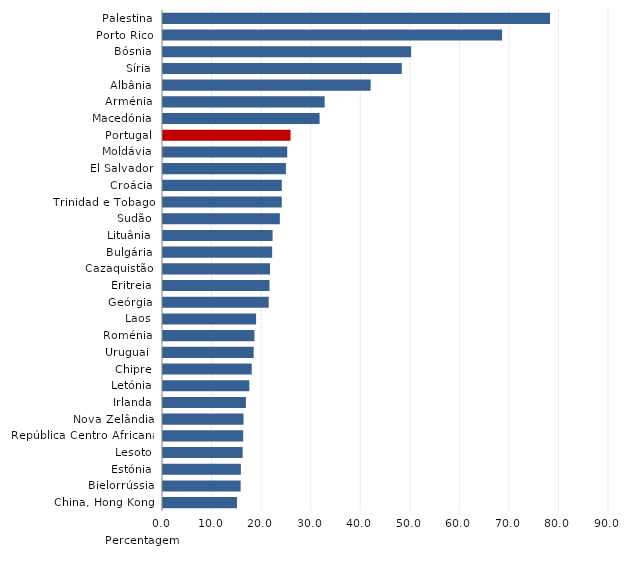
| Category | Series 0 |
|---|---|
| Palestina | 78.103 |
| Porto Rico | 68.431 |
| Bósnia | 50.077 |
| Síria | 48.186 |
| Albânia | 41.897 |
| Arménia | 32.621 |
| Macedónia | 31.595 |
| Portugal | 25.734 |
| Moldávia | 25.064 |
| El Salvador | 24.804 |
| Croácia | 23.969 |
| Trinidad e Tobago | 23.965 |
| Sudão | 23.578 |
| Lituânia | 22.113 |
| Bulgária | 22.026 |
| Cazaquistão | 21.592 |
| Eritreia | 21.489 |
| Geórgia | 21.338 |
| Laos | 18.789 |
| Roménia | 18.45 |
| Uruguai  | 18.298 |
| Chipre | 17.909 |
| Letónia | 17.423 |
| Irlanda | 16.729 |
| Nova Zelândia | 16.251 |
| República Centro Africana | 16.182 |
| Lesoto | 16.072 |
| Estónia | 15.71 |
| Bielorrússia | 15.666 |
| China, Hong Kong | 14.932 |